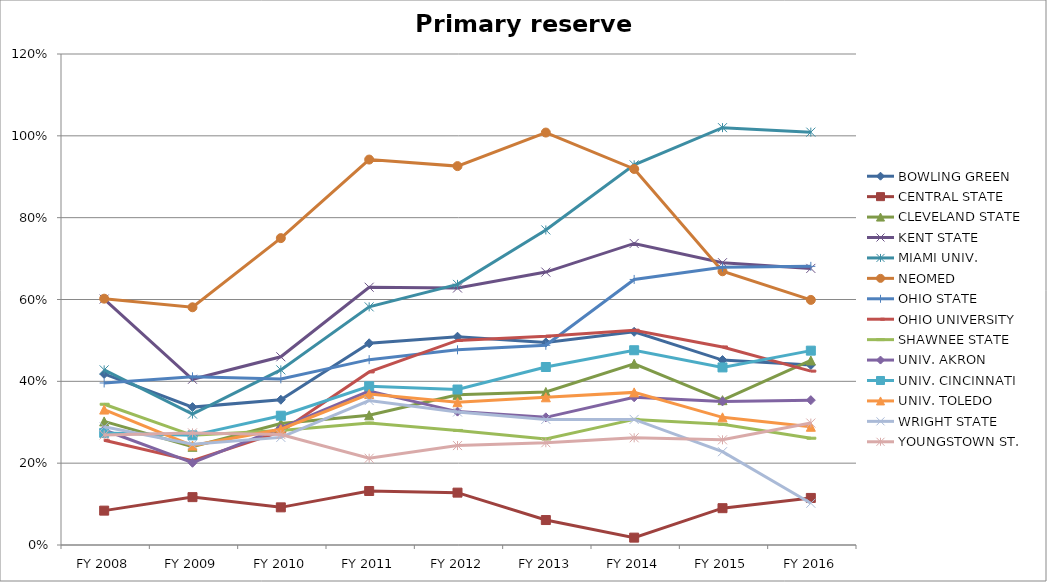
| Category | BOWLING GREEN  | CENTRAL STATE  | CLEVELAND STATE  | KENT STATE  | MIAMI UNIV.  | NEOMED  | OHIO STATE  | OHIO UNIVERSITY  | SHAWNEE STATE  | UNIV. AKRON  | UNIV. CINCINNATI  | UNIV. TOLEDO  | WRIGHT STATE  | YOUNGSTOWN ST.  |
|---|---|---|---|---|---|---|---|---|---|---|---|---|---|---|
| FY 2016 | 0.44 | 0.115 | 0.451 | 0.676 | 1.009 | 0.599 | 0.681 | 0.425 | 0.261 | 0.354 | 0.475 | 0.289 | 0.102 | 0.298 |
| FY 2015 | 0.452 | 0.09 | 0.354 | 0.69 | 1.02 | 0.669 | 0.679 | 0.484 | 0.295 | 0.351 | 0.434 | 0.312 | 0.228 | 0.257 |
| FY 2014 | 0.521 | 0.018 | 0.443 | 0.737 | 0.929 | 0.919 | 0.649 | 0.525 | 0.307 | 0.361 | 0.476 | 0.373 | 0.307 | 0.262 |
| FY 2013 | 0.495 | 0.061 | 0.374 | 0.667 | 0.77 | 1.008 | 0.488 | 0.51 | 0.259 | 0.312 | 0.435 | 0.361 | 0.307 | 0.25 |
| FY 2012 | 0.509 | 0.128 | 0.367 | 0.628 | 0.637 | 0.926 | 0.477 | 0.5 | 0.28 | 0.326 | 0.38 | 0.349 | 0.325 | 0.243 |
| FY 2011 | 0.493 | 0.132 | 0.317 | 0.63 | 0.582 | 0.942 | 0.453 | 0.423 | 0.298 | 0.376 | 0.388 | 0.369 | 0.353 | 0.212 |
| FY 2010 | 0.355 | 0.092 | 0.297 | 0.46 | 0.428 | 0.75 | 0.406 | 0.277 | 0.28 | 0.286 | 0.316 | 0.283 | 0.263 | 0.27 |
| FY 2009 | 0.337 | 0.117 | 0.24 | 0.405 | 0.32 | 0.581 | 0.411 | 0.206 | 0.268 | 0.201 | 0.268 | 0.243 | 0.246 | 0.274 |
| FY 2008 | 0.418 | 0.084 | 0.302 | 0.601 | 0.428 | 0.602 | 0.396 | 0.256 | 0.344 | 0.281 | 0.274 | 0.331 | 0.289 | 0.269 |